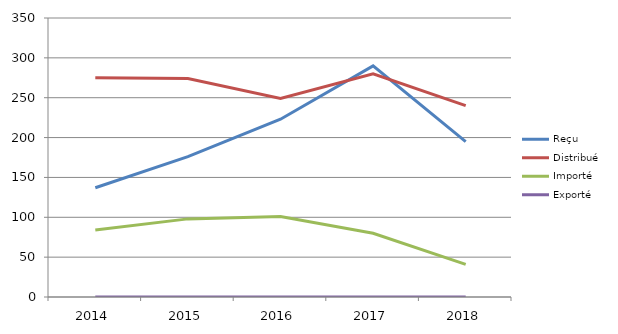
| Category | Reçu | Distribué | Importé | Exporté |
|---|---|---|---|---|
| 2014.0 | 137 | 275 | 84 | 0 |
| 2015.0 | 176 | 274 | 98 | 0 |
| 2016.0 | 223 | 249 | 101 | 0 |
| 2017.0 | 290 | 280 | 80 | 0 |
| 2018.0 | 195 | 240 | 41 | 0 |